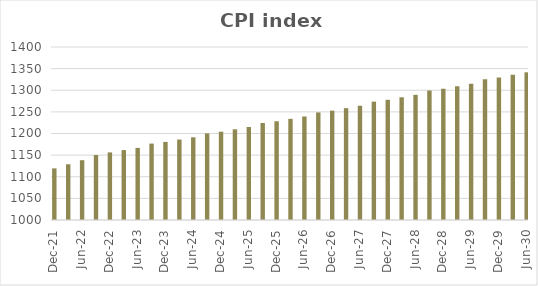
| Category | Series 0 |
|---|---|
| 2021-12-31 | 1119.363 |
| 2022-03-31 | 1128.876 |
| 2022-06-30 | 1138.264 |
| 2022-09-30 | 1150.24 |
| 2022-12-31 | 1156.302 |
| 2023-03-31 | 1161.613 |
| 2023-06-30 | 1166.721 |
| 2023-09-30 | 1176.696 |
| 2023-12-31 | 1180.584 |
| 2024-03-31 | 1186.007 |
| 2024-06-30 | 1191.222 |
| 2024-09-30 | 1200.229 |
| 2024-12-31 | 1204.196 |
| 2025-03-31 | 1209.727 |
| 2025-06-30 | 1215.046 |
| 2025-09-30 | 1224.234 |
| 2025-12-31 | 1228.28 |
| 2026-03-31 | 1233.922 |
| 2026-06-30 | 1239.347 |
| 2026-09-30 | 1248.719 |
| 2026-12-31 | 1252.846 |
| 2027-03-31 | 1258.6 |
| 2027-06-30 | 1264.134 |
| 2027-09-30 | 1273.693 |
| 2027-12-31 | 1277.902 |
| 2028-03-31 | 1283.772 |
| 2028-06-30 | 1289.417 |
| 2028-09-30 | 1299.167 |
| 2028-12-31 | 1303.46 |
| 2029-03-31 | 1309.448 |
| 2029-06-30 | 1315.205 |
| 2029-09-30 | 1325.15 |
| 2029-12-31 | 1329.53 |
| 2030-03-31 | 1335.637 |
| 2030-06-30 | 1341.509 |